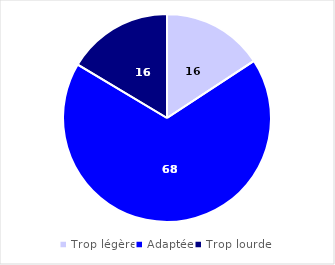
| Category | Series 0 |
|---|---|
| Trop légère | 15.75 |
| Adaptée | 67.83 |
| Trop lourde | 16.42 |